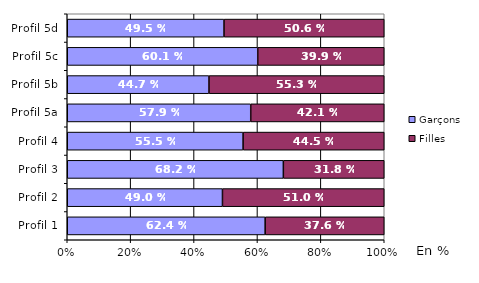
| Category | Garçons | Filles |
|---|---|---|
| Profil 1 | 0.624 | 0.376 |
| Profil 2 | 0.49 | 0.51 |
| Profil 3 | 0.682 | 0.318 |
| Profil 4 | 0.555 | 0.445 |
| Profil 5a | 0.579 | 0.421 |
| Profil 5b | 0.447 | 0.553 |
| Profil 5c | 0.601 | 0.399 |
| Profil 5d | 0.494 | 0.505 |